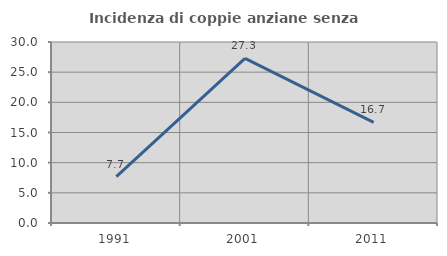
| Category | Incidenza di coppie anziane senza figli  |
|---|---|
| 1991.0 | 7.692 |
| 2001.0 | 27.273 |
| 2011.0 | 16.667 |